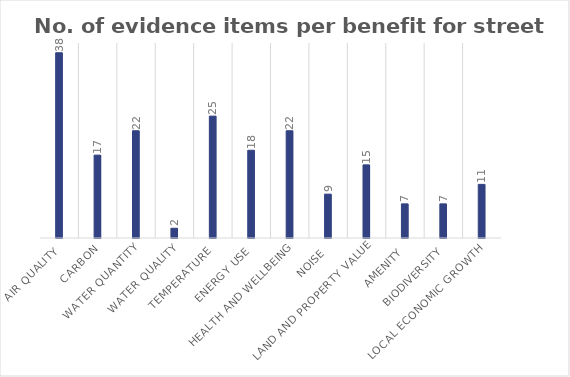
| Category | No. of evidence items |
|---|---|
| Air quality | 38 |
| Carbon | 17 |
| Water quantity | 22 |
| Water quality | 2 |
| Temperature | 25 |
| Energy use | 18 |
| Health and wellbeing | 22 |
| Noise | 9 |
| Land and property value | 15 |
| Amenity | 7 |
| Biodiversity | 7 |
| Local economic growth | 11 |